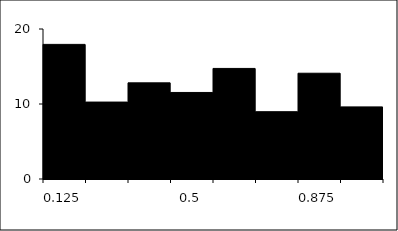
| Category | Series 1 |
|---|---|
| 0.125 | 17.949 |
| 0.25 | 10.256 |
| 0.375 | 12.821 |
| 0.5 | 11.538 |
| 0.625 | 14.744 |
| 0.75 | 8.974 |
| 0.875 | 14.103 |
| 1.0 | 9.615 |